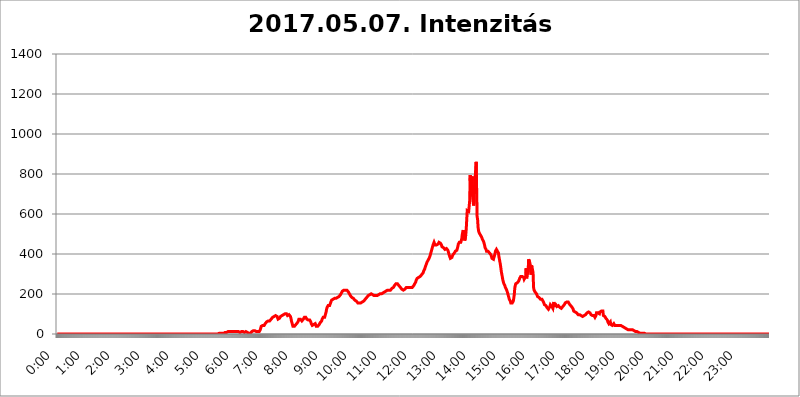
| Category | 2017.05.07. Intenzitás [W/m^2] |
|---|---|
| 0.0 | 0 |
| 0.0006944444444444445 | 0 |
| 0.001388888888888889 | 0 |
| 0.0020833333333333333 | 0 |
| 0.002777777777777778 | 0 |
| 0.003472222222222222 | 0 |
| 0.004166666666666667 | 0 |
| 0.004861111111111111 | 0 |
| 0.005555555555555556 | 0 |
| 0.0062499999999999995 | 0 |
| 0.006944444444444444 | 0 |
| 0.007638888888888889 | 0 |
| 0.008333333333333333 | 0 |
| 0.009027777777777779 | 0 |
| 0.009722222222222222 | 0 |
| 0.010416666666666666 | 0 |
| 0.011111111111111112 | 0 |
| 0.011805555555555555 | 0 |
| 0.012499999999999999 | 0 |
| 0.013194444444444444 | 0 |
| 0.013888888888888888 | 0 |
| 0.014583333333333332 | 0 |
| 0.015277777777777777 | 0 |
| 0.015972222222222224 | 0 |
| 0.016666666666666666 | 0 |
| 0.017361111111111112 | 0 |
| 0.018055555555555557 | 0 |
| 0.01875 | 0 |
| 0.019444444444444445 | 0 |
| 0.02013888888888889 | 0 |
| 0.020833333333333332 | 0 |
| 0.02152777777777778 | 0 |
| 0.022222222222222223 | 0 |
| 0.02291666666666667 | 0 |
| 0.02361111111111111 | 0 |
| 0.024305555555555556 | 0 |
| 0.024999999999999998 | 0 |
| 0.025694444444444447 | 0 |
| 0.02638888888888889 | 0 |
| 0.027083333333333334 | 0 |
| 0.027777777777777776 | 0 |
| 0.02847222222222222 | 0 |
| 0.029166666666666664 | 0 |
| 0.029861111111111113 | 0 |
| 0.030555555555555555 | 0 |
| 0.03125 | 0 |
| 0.03194444444444445 | 0 |
| 0.03263888888888889 | 0 |
| 0.03333333333333333 | 0 |
| 0.034027777777777775 | 0 |
| 0.034722222222222224 | 0 |
| 0.035416666666666666 | 0 |
| 0.036111111111111115 | 0 |
| 0.03680555555555556 | 0 |
| 0.0375 | 0 |
| 0.03819444444444444 | 0 |
| 0.03888888888888889 | 0 |
| 0.03958333333333333 | 0 |
| 0.04027777777777778 | 0 |
| 0.04097222222222222 | 0 |
| 0.041666666666666664 | 0 |
| 0.042361111111111106 | 0 |
| 0.04305555555555556 | 0 |
| 0.043750000000000004 | 0 |
| 0.044444444444444446 | 0 |
| 0.04513888888888889 | 0 |
| 0.04583333333333334 | 0 |
| 0.04652777777777778 | 0 |
| 0.04722222222222222 | 0 |
| 0.04791666666666666 | 0 |
| 0.04861111111111111 | 0 |
| 0.049305555555555554 | 0 |
| 0.049999999999999996 | 0 |
| 0.05069444444444445 | 0 |
| 0.051388888888888894 | 0 |
| 0.052083333333333336 | 0 |
| 0.05277777777777778 | 0 |
| 0.05347222222222222 | 0 |
| 0.05416666666666667 | 0 |
| 0.05486111111111111 | 0 |
| 0.05555555555555555 | 0 |
| 0.05625 | 0 |
| 0.05694444444444444 | 0 |
| 0.057638888888888885 | 0 |
| 0.05833333333333333 | 0 |
| 0.05902777777777778 | 0 |
| 0.059722222222222225 | 0 |
| 0.06041666666666667 | 0 |
| 0.061111111111111116 | 0 |
| 0.06180555555555556 | 0 |
| 0.0625 | 0 |
| 0.06319444444444444 | 0 |
| 0.06388888888888888 | 0 |
| 0.06458333333333334 | 0 |
| 0.06527777777777778 | 0 |
| 0.06597222222222222 | 0 |
| 0.06666666666666667 | 0 |
| 0.06736111111111111 | 0 |
| 0.06805555555555555 | 0 |
| 0.06874999999999999 | 0 |
| 0.06944444444444443 | 0 |
| 0.07013888888888889 | 0 |
| 0.07083333333333333 | 0 |
| 0.07152777777777779 | 0 |
| 0.07222222222222223 | 0 |
| 0.07291666666666667 | 0 |
| 0.07361111111111111 | 0 |
| 0.07430555555555556 | 0 |
| 0.075 | 0 |
| 0.07569444444444444 | 0 |
| 0.0763888888888889 | 0 |
| 0.07708333333333334 | 0 |
| 0.07777777777777778 | 0 |
| 0.07847222222222222 | 0 |
| 0.07916666666666666 | 0 |
| 0.0798611111111111 | 0 |
| 0.08055555555555556 | 0 |
| 0.08125 | 0 |
| 0.08194444444444444 | 0 |
| 0.08263888888888889 | 0 |
| 0.08333333333333333 | 0 |
| 0.08402777777777777 | 0 |
| 0.08472222222222221 | 0 |
| 0.08541666666666665 | 0 |
| 0.08611111111111112 | 0 |
| 0.08680555555555557 | 0 |
| 0.08750000000000001 | 0 |
| 0.08819444444444445 | 0 |
| 0.08888888888888889 | 0 |
| 0.08958333333333333 | 0 |
| 0.09027777777777778 | 0 |
| 0.09097222222222222 | 0 |
| 0.09166666666666667 | 0 |
| 0.09236111111111112 | 0 |
| 0.09305555555555556 | 0 |
| 0.09375 | 0 |
| 0.09444444444444444 | 0 |
| 0.09513888888888888 | 0 |
| 0.09583333333333333 | 0 |
| 0.09652777777777777 | 0 |
| 0.09722222222222222 | 0 |
| 0.09791666666666667 | 0 |
| 0.09861111111111111 | 0 |
| 0.09930555555555555 | 0 |
| 0.09999999999999999 | 0 |
| 0.10069444444444443 | 0 |
| 0.1013888888888889 | 0 |
| 0.10208333333333335 | 0 |
| 0.10277777777777779 | 0 |
| 0.10347222222222223 | 0 |
| 0.10416666666666667 | 0 |
| 0.10486111111111111 | 0 |
| 0.10555555555555556 | 0 |
| 0.10625 | 0 |
| 0.10694444444444444 | 0 |
| 0.1076388888888889 | 0 |
| 0.10833333333333334 | 0 |
| 0.10902777777777778 | 0 |
| 0.10972222222222222 | 0 |
| 0.1111111111111111 | 0 |
| 0.11180555555555556 | 0 |
| 0.11180555555555556 | 0 |
| 0.1125 | 0 |
| 0.11319444444444444 | 0 |
| 0.11388888888888889 | 0 |
| 0.11458333333333333 | 0 |
| 0.11527777777777777 | 0 |
| 0.11597222222222221 | 0 |
| 0.11666666666666665 | 0 |
| 0.1173611111111111 | 0 |
| 0.11805555555555557 | 0 |
| 0.11944444444444445 | 0 |
| 0.12013888888888889 | 0 |
| 0.12083333333333333 | 0 |
| 0.12152777777777778 | 0 |
| 0.12222222222222223 | 0 |
| 0.12291666666666667 | 0 |
| 0.12291666666666667 | 0 |
| 0.12361111111111112 | 0 |
| 0.12430555555555556 | 0 |
| 0.125 | 0 |
| 0.12569444444444444 | 0 |
| 0.12638888888888888 | 0 |
| 0.12708333333333333 | 0 |
| 0.16875 | 0 |
| 0.12847222222222224 | 0 |
| 0.12916666666666668 | 0 |
| 0.12986111111111112 | 0 |
| 0.13055555555555556 | 0 |
| 0.13125 | 0 |
| 0.13194444444444445 | 0 |
| 0.1326388888888889 | 0 |
| 0.13333333333333333 | 0 |
| 0.13402777777777777 | 0 |
| 0.13402777777777777 | 0 |
| 0.13472222222222222 | 0 |
| 0.13541666666666666 | 0 |
| 0.1361111111111111 | 0 |
| 0.13749999999999998 | 0 |
| 0.13819444444444443 | 0 |
| 0.1388888888888889 | 0 |
| 0.13958333333333334 | 0 |
| 0.14027777777777778 | 0 |
| 0.14097222222222222 | 0 |
| 0.14166666666666666 | 0 |
| 0.1423611111111111 | 0 |
| 0.14305555555555557 | 0 |
| 0.14375000000000002 | 0 |
| 0.14444444444444446 | 0 |
| 0.1451388888888889 | 0 |
| 0.1451388888888889 | 0 |
| 0.14652777777777778 | 0 |
| 0.14722222222222223 | 0 |
| 0.14791666666666667 | 0 |
| 0.1486111111111111 | 0 |
| 0.14930555555555555 | 0 |
| 0.15 | 0 |
| 0.15069444444444444 | 0 |
| 0.15138888888888888 | 0 |
| 0.15208333333333332 | 0 |
| 0.15277777777777776 | 0 |
| 0.15347222222222223 | 0 |
| 0.15416666666666667 | 0 |
| 0.15486111111111112 | 0 |
| 0.15555555555555556 | 0 |
| 0.15625 | 0 |
| 0.15694444444444444 | 0 |
| 0.15763888888888888 | 0 |
| 0.15833333333333333 | 0 |
| 0.15902777777777777 | 0 |
| 0.15972222222222224 | 0 |
| 0.16041666666666668 | 0 |
| 0.16111111111111112 | 0 |
| 0.16180555555555556 | 0 |
| 0.1625 | 0 |
| 0.16319444444444445 | 0 |
| 0.1638888888888889 | 0 |
| 0.16458333333333333 | 0 |
| 0.16527777777777777 | 0 |
| 0.16597222222222222 | 0 |
| 0.16666666666666666 | 0 |
| 0.1673611111111111 | 0 |
| 0.16805555555555554 | 0 |
| 0.16874999999999998 | 0 |
| 0.16944444444444443 | 0 |
| 0.17013888888888887 | 0 |
| 0.1708333333333333 | 0 |
| 0.17152777777777775 | 0 |
| 0.17222222222222225 | 0 |
| 0.1729166666666667 | 0 |
| 0.17361111111111113 | 0 |
| 0.17430555555555557 | 0 |
| 0.17500000000000002 | 0 |
| 0.17569444444444446 | 0 |
| 0.1763888888888889 | 0 |
| 0.17708333333333334 | 0 |
| 0.17777777777777778 | 0 |
| 0.17847222222222223 | 0 |
| 0.17916666666666667 | 0 |
| 0.1798611111111111 | 0 |
| 0.18055555555555555 | 0 |
| 0.18125 | 0 |
| 0.18194444444444444 | 0 |
| 0.1826388888888889 | 0 |
| 0.18333333333333335 | 0 |
| 0.1840277777777778 | 0 |
| 0.18472222222222223 | 0 |
| 0.18541666666666667 | 0 |
| 0.18611111111111112 | 0 |
| 0.18680555555555556 | 0 |
| 0.1875 | 0 |
| 0.18819444444444444 | 0 |
| 0.18888888888888888 | 0 |
| 0.18958333333333333 | 0 |
| 0.19027777777777777 | 0 |
| 0.1909722222222222 | 0 |
| 0.19166666666666665 | 0 |
| 0.19236111111111112 | 0 |
| 0.19305555555555554 | 0 |
| 0.19375 | 0 |
| 0.19444444444444445 | 0 |
| 0.1951388888888889 | 0 |
| 0.19583333333333333 | 0 |
| 0.19652777777777777 | 0 |
| 0.19722222222222222 | 0 |
| 0.19791666666666666 | 0 |
| 0.1986111111111111 | 0 |
| 0.19930555555555554 | 0 |
| 0.19999999999999998 | 0 |
| 0.20069444444444443 | 0 |
| 0.20138888888888887 | 0 |
| 0.2020833333333333 | 0 |
| 0.2027777777777778 | 0 |
| 0.2034722222222222 | 0 |
| 0.2041666666666667 | 0 |
| 0.20486111111111113 | 0 |
| 0.20555555555555557 | 0 |
| 0.20625000000000002 | 0 |
| 0.20694444444444446 | 0 |
| 0.2076388888888889 | 0 |
| 0.20833333333333334 | 0 |
| 0.20902777777777778 | 0 |
| 0.20972222222222223 | 0 |
| 0.21041666666666667 | 0 |
| 0.2111111111111111 | 0 |
| 0.21180555555555555 | 0 |
| 0.2125 | 0 |
| 0.21319444444444444 | 0 |
| 0.2138888888888889 | 0 |
| 0.21458333333333335 | 0 |
| 0.2152777777777778 | 0 |
| 0.21597222222222223 | 0 |
| 0.21666666666666667 | 0 |
| 0.21736111111111112 | 0 |
| 0.21805555555555556 | 0 |
| 0.21875 | 0 |
| 0.21944444444444444 | 0 |
| 0.22013888888888888 | 0 |
| 0.22083333333333333 | 0 |
| 0.22152777777777777 | 0 |
| 0.2222222222222222 | 0 |
| 0.22291666666666665 | 0 |
| 0.2236111111111111 | 0 |
| 0.22430555555555556 | 0 |
| 0.225 | 0 |
| 0.22569444444444445 | 3.525 |
| 0.2263888888888889 | 3.525 |
| 0.22708333333333333 | 3.525 |
| 0.22777777777777777 | 3.525 |
| 0.22847222222222222 | 3.525 |
| 0.22916666666666666 | 3.525 |
| 0.2298611111111111 | 3.525 |
| 0.23055555555555554 | 3.525 |
| 0.23124999999999998 | 3.525 |
| 0.23194444444444443 | 3.525 |
| 0.23263888888888887 | 3.525 |
| 0.2333333333333333 | 3.525 |
| 0.2340277777777778 | 7.887 |
| 0.2347222222222222 | 7.887 |
| 0.2354166666666667 | 7.887 |
| 0.23611111111111113 | 7.887 |
| 0.23680555555555557 | 7.887 |
| 0.23750000000000002 | 7.887 |
| 0.23819444444444446 | 7.887 |
| 0.2388888888888889 | 12.257 |
| 0.23958333333333334 | 12.257 |
| 0.24027777777777778 | 12.257 |
| 0.24097222222222223 | 12.257 |
| 0.24166666666666667 | 12.257 |
| 0.2423611111111111 | 12.257 |
| 0.24305555555555555 | 12.257 |
| 0.24375 | 12.257 |
| 0.24444444444444446 | 12.257 |
| 0.24513888888888888 | 12.257 |
| 0.24583333333333335 | 12.257 |
| 0.2465277777777778 | 12.257 |
| 0.24722222222222223 | 12.257 |
| 0.24791666666666667 | 12.257 |
| 0.24861111111111112 | 12.257 |
| 0.24930555555555556 | 12.257 |
| 0.25 | 12.257 |
| 0.25069444444444444 | 12.257 |
| 0.2513888888888889 | 12.257 |
| 0.2520833333333333 | 12.257 |
| 0.25277777777777777 | 12.257 |
| 0.2534722222222222 | 12.257 |
| 0.25416666666666665 | 12.257 |
| 0.2548611111111111 | 7.887 |
| 0.2555555555555556 | 7.887 |
| 0.25625000000000003 | 7.887 |
| 0.2569444444444445 | 12.257 |
| 0.2576388888888889 | 12.257 |
| 0.25833333333333336 | 12.257 |
| 0.2590277777777778 | 12.257 |
| 0.25972222222222224 | 12.257 |
| 0.2604166666666667 | 12.257 |
| 0.2611111111111111 | 7.887 |
| 0.26180555555555557 | 7.887 |
| 0.2625 | 7.887 |
| 0.26319444444444445 | 7.887 |
| 0.2638888888888889 | 12.257 |
| 0.26458333333333334 | 12.257 |
| 0.2652777777777778 | 12.257 |
| 0.2659722222222222 | 12.257 |
| 0.26666666666666666 | 7.887 |
| 0.2673611111111111 | 7.887 |
| 0.26805555555555555 | 3.525 |
| 0.26875 | 3.525 |
| 0.26944444444444443 | 3.525 |
| 0.2701388888888889 | 3.525 |
| 0.2708333333333333 | 3.525 |
| 0.27152777777777776 | 7.887 |
| 0.2722222222222222 | 7.887 |
| 0.27291666666666664 | 12.257 |
| 0.2736111111111111 | 12.257 |
| 0.2743055555555555 | 16.636 |
| 0.27499999999999997 | 16.636 |
| 0.27569444444444446 | 21.024 |
| 0.27638888888888885 | 16.636 |
| 0.27708333333333335 | 16.636 |
| 0.2777777777777778 | 16.636 |
| 0.27847222222222223 | 16.636 |
| 0.2791666666666667 | 12.257 |
| 0.2798611111111111 | 12.257 |
| 0.28055555555555556 | 12.257 |
| 0.28125 | 12.257 |
| 0.28194444444444444 | 12.257 |
| 0.2826388888888889 | 12.257 |
| 0.2833333333333333 | 12.257 |
| 0.28402777777777777 | 12.257 |
| 0.2847222222222222 | 21.024 |
| 0.28541666666666665 | 29.823 |
| 0.28611111111111115 | 38.653 |
| 0.28680555555555554 | 43.079 |
| 0.28750000000000003 | 43.079 |
| 0.2881944444444445 | 43.079 |
| 0.2888888888888889 | 38.653 |
| 0.28958333333333336 | 38.653 |
| 0.2902777777777778 | 43.079 |
| 0.29097222222222224 | 47.511 |
| 0.2916666666666667 | 51.951 |
| 0.2923611111111111 | 56.398 |
| 0.29305555555555557 | 56.398 |
| 0.29375 | 60.85 |
| 0.29444444444444445 | 65.31 |
| 0.2951388888888889 | 65.31 |
| 0.29583333333333334 | 65.31 |
| 0.2965277777777778 | 65.31 |
| 0.2972222222222222 | 69.775 |
| 0.29791666666666666 | 65.31 |
| 0.2986111111111111 | 65.31 |
| 0.29930555555555555 | 69.775 |
| 0.3 | 74.246 |
| 0.30069444444444443 | 74.246 |
| 0.3013888888888889 | 78.722 |
| 0.3020833333333333 | 83.205 |
| 0.30277777777777776 | 83.205 |
| 0.3034722222222222 | 83.205 |
| 0.30416666666666664 | 87.692 |
| 0.3048611111111111 | 92.184 |
| 0.3055555555555555 | 92.184 |
| 0.30624999999999997 | 92.184 |
| 0.3069444444444444 | 92.184 |
| 0.3076388888888889 | 92.184 |
| 0.30833333333333335 | 87.692 |
| 0.3090277777777778 | 83.205 |
| 0.30972222222222223 | 74.246 |
| 0.3104166666666667 | 74.246 |
| 0.3111111111111111 | 74.246 |
| 0.31180555555555556 | 78.722 |
| 0.3125 | 83.205 |
| 0.31319444444444444 | 87.692 |
| 0.3138888888888889 | 92.184 |
| 0.3145833333333333 | 92.184 |
| 0.31527777777777777 | 92.184 |
| 0.3159722222222222 | 96.682 |
| 0.31666666666666665 | 96.682 |
| 0.31736111111111115 | 96.682 |
| 0.31805555555555554 | 101.184 |
| 0.31875000000000003 | 101.184 |
| 0.3194444444444445 | 101.184 |
| 0.3201388888888889 | 101.184 |
| 0.32083333333333336 | 101.184 |
| 0.3215277777777778 | 101.184 |
| 0.32222222222222224 | 96.682 |
| 0.3229166666666667 | 92.184 |
| 0.3236111111111111 | 96.682 |
| 0.32430555555555557 | 96.682 |
| 0.325 | 96.682 |
| 0.32569444444444445 | 96.682 |
| 0.3263888888888889 | 92.184 |
| 0.32708333333333334 | 87.692 |
| 0.3277777777777778 | 78.722 |
| 0.3284722222222222 | 65.31 |
| 0.32916666666666666 | 56.398 |
| 0.3298611111111111 | 47.511 |
| 0.33055555555555555 | 38.653 |
| 0.33125 | 38.653 |
| 0.33194444444444443 | 38.653 |
| 0.3326388888888889 | 38.653 |
| 0.3333333333333333 | 38.653 |
| 0.3340277777777778 | 43.079 |
| 0.3347222222222222 | 47.511 |
| 0.3354166666666667 | 51.951 |
| 0.3361111111111111 | 51.951 |
| 0.3368055555555556 | 56.398 |
| 0.33749999999999997 | 60.85 |
| 0.33819444444444446 | 65.31 |
| 0.33888888888888885 | 74.246 |
| 0.33958333333333335 | 78.722 |
| 0.34027777777777773 | 78.722 |
| 0.34097222222222223 | 74.246 |
| 0.3416666666666666 | 74.246 |
| 0.3423611111111111 | 69.775 |
| 0.3430555555555555 | 65.31 |
| 0.34375 | 69.775 |
| 0.3444444444444445 | 69.775 |
| 0.3451388888888889 | 74.246 |
| 0.3458333333333334 | 74.246 |
| 0.34652777777777777 | 83.205 |
| 0.34722222222222227 | 83.205 |
| 0.34791666666666665 | 83.205 |
| 0.34861111111111115 | 83.205 |
| 0.34930555555555554 | 83.205 |
| 0.35000000000000003 | 74.246 |
| 0.3506944444444444 | 74.246 |
| 0.3513888888888889 | 69.775 |
| 0.3520833333333333 | 69.775 |
| 0.3527777777777778 | 69.775 |
| 0.3534722222222222 | 69.775 |
| 0.3541666666666667 | 69.775 |
| 0.3548611111111111 | 65.31 |
| 0.35555555555555557 | 60.85 |
| 0.35625 | 51.951 |
| 0.35694444444444445 | 47.511 |
| 0.3576388888888889 | 43.079 |
| 0.35833333333333334 | 43.079 |
| 0.3590277777777778 | 47.511 |
| 0.3597222222222222 | 47.511 |
| 0.36041666666666666 | 47.511 |
| 0.3611111111111111 | 51.951 |
| 0.36180555555555555 | 51.951 |
| 0.3625 | 47.511 |
| 0.36319444444444443 | 38.653 |
| 0.3638888888888889 | 38.653 |
| 0.3645833333333333 | 38.653 |
| 0.3652777777777778 | 38.653 |
| 0.3659722222222222 | 43.079 |
| 0.3666666666666667 | 43.079 |
| 0.3673611111111111 | 47.511 |
| 0.3680555555555556 | 51.951 |
| 0.36874999999999997 | 56.398 |
| 0.36944444444444446 | 56.398 |
| 0.37013888888888885 | 60.85 |
| 0.37083333333333335 | 65.31 |
| 0.37152777777777773 | 74.246 |
| 0.37222222222222223 | 78.722 |
| 0.3729166666666666 | 83.205 |
| 0.3736111111111111 | 83.205 |
| 0.3743055555555555 | 83.205 |
| 0.375 | 83.205 |
| 0.3756944444444445 | 92.184 |
| 0.3763888888888889 | 101.184 |
| 0.3770833333333334 | 110.201 |
| 0.37777777777777777 | 123.758 |
| 0.37847222222222227 | 132.814 |
| 0.37916666666666665 | 137.347 |
| 0.37986111111111115 | 141.884 |
| 0.38055555555555554 | 141.884 |
| 0.38125000000000003 | 137.347 |
| 0.3819444444444444 | 141.884 |
| 0.3826388888888889 | 146.423 |
| 0.3833333333333333 | 155.509 |
| 0.3840277777777778 | 160.056 |
| 0.3847222222222222 | 169.156 |
| 0.3854166666666667 | 173.709 |
| 0.3861111111111111 | 173.709 |
| 0.38680555555555557 | 173.709 |
| 0.3875 | 178.264 |
| 0.38819444444444445 | 178.264 |
| 0.3888888888888889 | 178.264 |
| 0.38958333333333334 | 178.264 |
| 0.3902777777777778 | 178.264 |
| 0.3909722222222222 | 178.264 |
| 0.39166666666666666 | 178.264 |
| 0.3923611111111111 | 178.264 |
| 0.39305555555555555 | 182.82 |
| 0.39375 | 182.82 |
| 0.39444444444444443 | 182.82 |
| 0.3951388888888889 | 187.378 |
| 0.3958333333333333 | 191.937 |
| 0.3965277777777778 | 191.937 |
| 0.3972222222222222 | 196.497 |
| 0.3979166666666667 | 201.058 |
| 0.3986111111111111 | 205.62 |
| 0.3993055555555556 | 210.182 |
| 0.39999999999999997 | 214.746 |
| 0.40069444444444446 | 219.309 |
| 0.40138888888888885 | 219.309 |
| 0.40208333333333335 | 219.309 |
| 0.40277777777777773 | 219.309 |
| 0.40347222222222223 | 219.309 |
| 0.4041666666666666 | 219.309 |
| 0.4048611111111111 | 219.309 |
| 0.4055555555555555 | 219.309 |
| 0.40625 | 219.309 |
| 0.4069444444444445 | 219.309 |
| 0.4076388888888889 | 214.746 |
| 0.4083333333333334 | 210.182 |
| 0.40902777777777777 | 205.62 |
| 0.40972222222222227 | 201.058 |
| 0.41041666666666665 | 196.497 |
| 0.41111111111111115 | 191.937 |
| 0.41180555555555554 | 191.937 |
| 0.41250000000000003 | 187.378 |
| 0.4131944444444444 | 182.82 |
| 0.4138888888888889 | 182.82 |
| 0.4145833333333333 | 178.264 |
| 0.4152777777777778 | 178.264 |
| 0.4159722222222222 | 173.709 |
| 0.4166666666666667 | 173.709 |
| 0.4173611111111111 | 169.156 |
| 0.41805555555555557 | 164.605 |
| 0.41875 | 164.605 |
| 0.41944444444444445 | 164.605 |
| 0.4201388888888889 | 160.056 |
| 0.42083333333333334 | 160.056 |
| 0.4215277777777778 | 155.509 |
| 0.4222222222222222 | 155.509 |
| 0.42291666666666666 | 155.509 |
| 0.4236111111111111 | 155.509 |
| 0.42430555555555555 | 155.509 |
| 0.425 | 155.509 |
| 0.42569444444444443 | 155.509 |
| 0.4263888888888889 | 155.509 |
| 0.4270833333333333 | 155.509 |
| 0.4277777777777778 | 160.056 |
| 0.4284722222222222 | 160.056 |
| 0.4291666666666667 | 164.605 |
| 0.4298611111111111 | 164.605 |
| 0.4305555555555556 | 169.156 |
| 0.43124999999999997 | 169.156 |
| 0.43194444444444446 | 173.709 |
| 0.43263888888888885 | 173.709 |
| 0.43333333333333335 | 178.264 |
| 0.43402777777777773 | 182.82 |
| 0.43472222222222223 | 182.82 |
| 0.4354166666666666 | 187.378 |
| 0.4361111111111111 | 191.937 |
| 0.4368055555555555 | 191.937 |
| 0.4375 | 196.497 |
| 0.4381944444444445 | 196.497 |
| 0.4388888888888889 | 196.497 |
| 0.4395833333333334 | 201.058 |
| 0.44027777777777777 | 201.058 |
| 0.44097222222222227 | 196.497 |
| 0.44166666666666665 | 196.497 |
| 0.44236111111111115 | 196.497 |
| 0.44305555555555554 | 191.937 |
| 0.44375000000000003 | 191.937 |
| 0.4444444444444444 | 191.937 |
| 0.4451388888888889 | 191.937 |
| 0.4458333333333333 | 191.937 |
| 0.4465277777777778 | 191.937 |
| 0.4472222222222222 | 191.937 |
| 0.4479166666666667 | 191.937 |
| 0.4486111111111111 | 191.937 |
| 0.44930555555555557 | 196.497 |
| 0.45 | 196.497 |
| 0.45069444444444445 | 196.497 |
| 0.4513888888888889 | 201.058 |
| 0.45208333333333334 | 201.058 |
| 0.4527777777777778 | 201.058 |
| 0.4534722222222222 | 201.058 |
| 0.45416666666666666 | 201.058 |
| 0.4548611111111111 | 201.058 |
| 0.45555555555555555 | 205.62 |
| 0.45625 | 205.62 |
| 0.45694444444444443 | 205.62 |
| 0.4576388888888889 | 205.62 |
| 0.4583333333333333 | 205.62 |
| 0.4590277777777778 | 210.182 |
| 0.4597222222222222 | 210.182 |
| 0.4604166666666667 | 210.182 |
| 0.4611111111111111 | 214.746 |
| 0.4618055555555556 | 214.746 |
| 0.46249999999999997 | 214.746 |
| 0.46319444444444446 | 219.309 |
| 0.46388888888888885 | 219.309 |
| 0.46458333333333335 | 214.746 |
| 0.46527777777777773 | 219.309 |
| 0.46597222222222223 | 219.309 |
| 0.4666666666666666 | 219.309 |
| 0.4673611111111111 | 219.309 |
| 0.4680555555555555 | 219.309 |
| 0.46875 | 223.873 |
| 0.4694444444444445 | 228.436 |
| 0.4701388888888889 | 228.436 |
| 0.4708333333333334 | 233 |
| 0.47152777777777777 | 233 |
| 0.47222222222222227 | 237.564 |
| 0.47291666666666665 | 242.127 |
| 0.47361111111111115 | 246.689 |
| 0.47430555555555554 | 246.689 |
| 0.47500000000000003 | 251.251 |
| 0.4756944444444444 | 251.251 |
| 0.4763888888888889 | 251.251 |
| 0.4770833333333333 | 251.251 |
| 0.4777777777777778 | 251.251 |
| 0.4784722222222222 | 246.689 |
| 0.4791666666666667 | 242.127 |
| 0.4798611111111111 | 242.127 |
| 0.48055555555555557 | 237.564 |
| 0.48125 | 233 |
| 0.48194444444444445 | 228.436 |
| 0.4826388888888889 | 228.436 |
| 0.48333333333333334 | 223.873 |
| 0.4840277777777778 | 223.873 |
| 0.4847222222222222 | 219.309 |
| 0.48541666666666666 | 219.309 |
| 0.4861111111111111 | 223.873 |
| 0.48680555555555555 | 223.873 |
| 0.4875 | 223.873 |
| 0.48819444444444443 | 228.436 |
| 0.4888888888888889 | 228.436 |
| 0.4895833333333333 | 233 |
| 0.4902777777777778 | 233 |
| 0.4909722222222222 | 233 |
| 0.4916666666666667 | 233 |
| 0.4923611111111111 | 233 |
| 0.4930555555555556 | 233 |
| 0.49374999999999997 | 233 |
| 0.49444444444444446 | 233 |
| 0.49513888888888885 | 233 |
| 0.49583333333333335 | 233 |
| 0.49652777777777773 | 233 |
| 0.49722222222222223 | 233 |
| 0.4979166666666666 | 233 |
| 0.4986111111111111 | 237.564 |
| 0.4993055555555555 | 237.564 |
| 0.5 | 242.127 |
| 0.5006944444444444 | 242.127 |
| 0.5013888888888889 | 251.251 |
| 0.5020833333333333 | 255.813 |
| 0.5027777777777778 | 260.373 |
| 0.5034722222222222 | 269.49 |
| 0.5041666666666667 | 269.49 |
| 0.5048611111111111 | 278.603 |
| 0.5055555555555555 | 278.603 |
| 0.50625 | 278.603 |
| 0.5069444444444444 | 283.156 |
| 0.5076388888888889 | 283.156 |
| 0.5083333333333333 | 287.709 |
| 0.5090277777777777 | 287.709 |
| 0.5097222222222222 | 292.259 |
| 0.5104166666666666 | 292.259 |
| 0.5111111111111112 | 296.808 |
| 0.5118055555555555 | 296.808 |
| 0.5125000000000001 | 301.354 |
| 0.5131944444444444 | 305.898 |
| 0.513888888888889 | 314.98 |
| 0.5145833333333333 | 319.517 |
| 0.5152777777777778 | 324.052 |
| 0.5159722222222222 | 333.113 |
| 0.5166666666666667 | 337.639 |
| 0.517361111111111 | 346.682 |
| 0.5180555555555556 | 351.198 |
| 0.5187499999999999 | 360.221 |
| 0.5194444444444445 | 364.728 |
| 0.5201388888888888 | 369.23 |
| 0.5208333333333334 | 373.729 |
| 0.5215277777777778 | 378.224 |
| 0.5222222222222223 | 382.715 |
| 0.5229166666666667 | 391.685 |
| 0.5236111111111111 | 396.164 |
| 0.5243055555555556 | 409.574 |
| 0.525 | 418.492 |
| 0.5256944444444445 | 427.39 |
| 0.5263888888888889 | 436.27 |
| 0.5270833333333333 | 445.129 |
| 0.5277777777777778 | 449.551 |
| 0.5284722222222222 | 458.38 |
| 0.5291666666666667 | 453.968 |
| 0.5298611111111111 | 445.129 |
| 0.5305555555555556 | 445.129 |
| 0.53125 | 445.129 |
| 0.5319444444444444 | 445.129 |
| 0.5326388888888889 | 445.129 |
| 0.5333333333333333 | 449.551 |
| 0.5340277777777778 | 449.551 |
| 0.5347222222222222 | 453.968 |
| 0.5354166666666667 | 458.38 |
| 0.5361111111111111 | 458.38 |
| 0.5368055555555555 | 458.38 |
| 0.5375 | 453.968 |
| 0.5381944444444444 | 453.968 |
| 0.5388888888888889 | 445.129 |
| 0.5395833333333333 | 436.27 |
| 0.5402777777777777 | 436.27 |
| 0.5409722222222222 | 436.27 |
| 0.5416666666666666 | 431.833 |
| 0.5423611111111112 | 427.39 |
| 0.5430555555555555 | 427.39 |
| 0.5437500000000001 | 422.943 |
| 0.5444444444444444 | 422.943 |
| 0.545138888888889 | 422.943 |
| 0.5458333333333333 | 427.39 |
| 0.5465277777777778 | 422.943 |
| 0.5472222222222222 | 422.943 |
| 0.5479166666666667 | 418.492 |
| 0.548611111111111 | 409.574 |
| 0.5493055555555556 | 400.638 |
| 0.5499999999999999 | 391.685 |
| 0.5506944444444445 | 387.202 |
| 0.5513888888888888 | 378.224 |
| 0.5520833333333334 | 378.224 |
| 0.5527777777777778 | 378.224 |
| 0.5534722222222223 | 382.715 |
| 0.5541666666666667 | 387.202 |
| 0.5548611111111111 | 396.164 |
| 0.5555555555555556 | 396.164 |
| 0.55625 | 400.638 |
| 0.5569444444444445 | 405.108 |
| 0.5576388888888889 | 409.574 |
| 0.5583333333333333 | 414.035 |
| 0.5590277777777778 | 414.035 |
| 0.5597222222222222 | 414.035 |
| 0.5604166666666667 | 418.492 |
| 0.5611111111111111 | 427.39 |
| 0.5618055555555556 | 436.27 |
| 0.5625 | 449.551 |
| 0.5631944444444444 | 453.968 |
| 0.5638888888888889 | 458.38 |
| 0.5645833333333333 | 458.38 |
| 0.5652777777777778 | 458.38 |
| 0.5659722222222222 | 458.38 |
| 0.5666666666666667 | 462.786 |
| 0.5673611111111111 | 475.972 |
| 0.5680555555555555 | 497.836 |
| 0.56875 | 510.885 |
| 0.5694444444444444 | 519.555 |
| 0.5701388888888889 | 515.223 |
| 0.5708333333333333 | 493.475 |
| 0.5715277777777777 | 467.187 |
| 0.5722222222222222 | 471.582 |
| 0.5729166666666666 | 493.475 |
| 0.5736111111111112 | 523.88 |
| 0.5743055555555555 | 571.049 |
| 0.5750000000000001 | 617.436 |
| 0.5756944444444444 | 617.436 |
| 0.576388888888889 | 613.252 |
| 0.5770833333333333 | 613.252 |
| 0.5777777777777778 | 617.436 |
| 0.5784722222222222 | 667.123 |
| 0.5791666666666667 | 795.074 |
| 0.579861111111111 | 719.877 |
| 0.5805555555555556 | 703.762 |
| 0.5812499999999999 | 707.8 |
| 0.5819444444444445 | 787.258 |
| 0.5826388888888888 | 683.473 |
| 0.5833333333333334 | 658.909 |
| 0.5840277777777778 | 642.4 |
| 0.5847222222222223 | 658.909 |
| 0.5854166666666667 | 747.834 |
| 0.5861111111111111 | 775.492 |
| 0.5868055555555556 | 779.42 |
| 0.5875 | 860.676 |
| 0.5881944444444445 | 727.896 |
| 0.5888888888888889 | 588.009 |
| 0.5895833333333333 | 571.049 |
| 0.5902777777777778 | 532.513 |
| 0.5909722222222222 | 515.223 |
| 0.5916666666666667 | 506.542 |
| 0.5923611111111111 | 502.192 |
| 0.5930555555555556 | 497.836 |
| 0.59375 | 497.836 |
| 0.5944444444444444 | 497.836 |
| 0.5951388888888889 | 484.735 |
| 0.5958333333333333 | 480.356 |
| 0.5965277777777778 | 471.582 |
| 0.5972222222222222 | 467.187 |
| 0.5979166666666667 | 462.786 |
| 0.5986111111111111 | 453.968 |
| 0.5993055555555555 | 445.129 |
| 0.6 | 431.833 |
| 0.6006944444444444 | 427.39 |
| 0.6013888888888889 | 422.943 |
| 0.6020833333333333 | 414.035 |
| 0.6027777777777777 | 414.035 |
| 0.6034722222222222 | 414.035 |
| 0.6041666666666666 | 414.035 |
| 0.6048611111111112 | 409.574 |
| 0.6055555555555555 | 409.574 |
| 0.6062500000000001 | 405.108 |
| 0.6069444444444444 | 405.108 |
| 0.607638888888889 | 400.638 |
| 0.6083333333333333 | 396.164 |
| 0.6090277777777778 | 387.202 |
| 0.6097222222222222 | 378.224 |
| 0.6104166666666667 | 378.224 |
| 0.611111111111111 | 373.729 |
| 0.6118055555555556 | 373.729 |
| 0.6124999999999999 | 378.224 |
| 0.6131944444444445 | 391.685 |
| 0.6138888888888888 | 400.638 |
| 0.6145833333333334 | 414.035 |
| 0.6152777777777778 | 418.492 |
| 0.6159722222222223 | 422.943 |
| 0.6166666666666667 | 422.943 |
| 0.6173611111111111 | 414.035 |
| 0.6180555555555556 | 414.035 |
| 0.61875 | 405.108 |
| 0.6194444444444445 | 387.202 |
| 0.6201388888888889 | 373.729 |
| 0.6208333333333333 | 360.221 |
| 0.6215277777777778 | 346.682 |
| 0.6222222222222222 | 328.584 |
| 0.6229166666666667 | 310.44 |
| 0.6236111111111111 | 296.808 |
| 0.6243055555555556 | 283.156 |
| 0.625 | 269.49 |
| 0.6256944444444444 | 260.373 |
| 0.6263888888888889 | 251.251 |
| 0.6270833333333333 | 246.689 |
| 0.6277777777777778 | 242.127 |
| 0.6284722222222222 | 233 |
| 0.6291666666666667 | 228.436 |
| 0.6298611111111111 | 223.873 |
| 0.6305555555555555 | 219.309 |
| 0.63125 | 210.182 |
| 0.6319444444444444 | 201.058 |
| 0.6326388888888889 | 191.937 |
| 0.6333333333333333 | 182.82 |
| 0.6340277777777777 | 173.709 |
| 0.6347222222222222 | 169.156 |
| 0.6354166666666666 | 164.605 |
| 0.6361111111111112 | 155.509 |
| 0.6368055555555555 | 155.509 |
| 0.6375000000000001 | 155.509 |
| 0.6381944444444444 | 155.509 |
| 0.638888888888889 | 160.056 |
| 0.6395833333333333 | 164.605 |
| 0.6402777777777778 | 178.264 |
| 0.6409722222222222 | 196.497 |
| 0.6416666666666667 | 228.436 |
| 0.642361111111111 | 242.127 |
| 0.6430555555555556 | 251.251 |
| 0.6437499999999999 | 251.251 |
| 0.6444444444444445 | 251.251 |
| 0.6451388888888888 | 255.813 |
| 0.6458333333333334 | 255.813 |
| 0.6465277777777778 | 260.373 |
| 0.6472222222222223 | 264.932 |
| 0.6479166666666667 | 269.49 |
| 0.6486111111111111 | 278.603 |
| 0.6493055555555556 | 283.156 |
| 0.65 | 287.709 |
| 0.6506944444444445 | 287.709 |
| 0.6513888888888889 | 287.709 |
| 0.6520833333333333 | 287.709 |
| 0.6527777777777778 | 287.709 |
| 0.6534722222222222 | 287.709 |
| 0.6541666666666667 | 283.156 |
| 0.6548611111111111 | 274.047 |
| 0.6555555555555556 | 269.49 |
| 0.65625 | 269.49 |
| 0.6569444444444444 | 287.709 |
| 0.6576388888888889 | 328.584 |
| 0.6583333333333333 | 278.603 |
| 0.6590277777777778 | 292.259 |
| 0.6597222222222222 | 287.709 |
| 0.6604166666666667 | 310.44 |
| 0.6611111111111111 | 373.729 |
| 0.6618055555555555 | 373.729 |
| 0.6625 | 360.221 |
| 0.6631944444444444 | 351.198 |
| 0.6638888888888889 | 346.682 |
| 0.6645833333333333 | 296.808 |
| 0.6652777777777777 | 342.162 |
| 0.6659722222222222 | 333.113 |
| 0.6666666666666666 | 319.517 |
| 0.6673611111111111 | 305.898 |
| 0.6680555555555556 | 233 |
| 0.6687500000000001 | 219.309 |
| 0.6694444444444444 | 214.746 |
| 0.6701388888888888 | 210.182 |
| 0.6708333333333334 | 210.182 |
| 0.6715277777777778 | 205.62 |
| 0.6722222222222222 | 201.058 |
| 0.6729166666666666 | 196.497 |
| 0.6736111111111112 | 187.378 |
| 0.6743055555555556 | 182.82 |
| 0.6749999999999999 | 182.82 |
| 0.6756944444444444 | 182.82 |
| 0.6763888888888889 | 182.82 |
| 0.6770833333333334 | 178.264 |
| 0.6777777777777777 | 173.709 |
| 0.6784722222222223 | 178.264 |
| 0.6791666666666667 | 173.709 |
| 0.6798611111111111 | 173.709 |
| 0.6805555555555555 | 173.709 |
| 0.68125 | 169.156 |
| 0.6819444444444445 | 160.056 |
| 0.6826388888888889 | 155.509 |
| 0.6833333333333332 | 146.423 |
| 0.6840277777777778 | 146.423 |
| 0.6847222222222222 | 141.884 |
| 0.6854166666666667 | 141.884 |
| 0.686111111111111 | 137.347 |
| 0.6868055555555556 | 132.814 |
| 0.6875 | 128.284 |
| 0.6881944444444444 | 128.284 |
| 0.688888888888889 | 123.758 |
| 0.6895833333333333 | 123.758 |
| 0.6902777777777778 | 128.284 |
| 0.6909722222222222 | 137.347 |
| 0.6916666666666668 | 146.423 |
| 0.6923611111111111 | 146.423 |
| 0.6930555555555555 | 141.884 |
| 0.69375 | 137.347 |
| 0.6944444444444445 | 132.814 |
| 0.6951388888888889 | 128.284 |
| 0.6958333333333333 | 132.814 |
| 0.6965277777777777 | 160.056 |
| 0.6972222222222223 | 141.884 |
| 0.6979166666666666 | 137.347 |
| 0.6986111111111111 | 141.884 |
| 0.6993055555555556 | 146.423 |
| 0.7000000000000001 | 141.884 |
| 0.7006944444444444 | 137.347 |
| 0.7013888888888888 | 137.347 |
| 0.7020833333333334 | 141.884 |
| 0.7027777777777778 | 141.884 |
| 0.7034722222222222 | 141.884 |
| 0.7041666666666666 | 137.347 |
| 0.7048611111111112 | 132.814 |
| 0.7055555555555556 | 128.284 |
| 0.7062499999999999 | 128.284 |
| 0.7069444444444444 | 128.284 |
| 0.7076388888888889 | 128.284 |
| 0.7083333333333334 | 132.814 |
| 0.7090277777777777 | 137.347 |
| 0.7097222222222223 | 141.884 |
| 0.7104166666666667 | 141.884 |
| 0.7111111111111111 | 146.423 |
| 0.7118055555555555 | 150.964 |
| 0.7125 | 155.509 |
| 0.7131944444444445 | 155.509 |
| 0.7138888888888889 | 160.056 |
| 0.7145833333333332 | 160.056 |
| 0.7152777777777778 | 160.056 |
| 0.7159722222222222 | 160.056 |
| 0.7166666666666667 | 160.056 |
| 0.717361111111111 | 155.509 |
| 0.7180555555555556 | 150.964 |
| 0.71875 | 146.423 |
| 0.7194444444444444 | 146.423 |
| 0.720138888888889 | 141.884 |
| 0.7208333333333333 | 141.884 |
| 0.7215277777777778 | 137.347 |
| 0.7222222222222222 | 132.814 |
| 0.7229166666666668 | 128.284 |
| 0.7236111111111111 | 123.758 |
| 0.7243055555555555 | 114.716 |
| 0.725 | 110.201 |
| 0.7256944444444445 | 110.201 |
| 0.7263888888888889 | 110.201 |
| 0.7270833333333333 | 110.201 |
| 0.7277777777777777 | 105.69 |
| 0.7284722222222223 | 105.69 |
| 0.7291666666666666 | 101.184 |
| 0.7298611111111111 | 101.184 |
| 0.7305555555555556 | 96.682 |
| 0.7312500000000001 | 96.682 |
| 0.7319444444444444 | 96.682 |
| 0.7326388888888888 | 96.682 |
| 0.7333333333333334 | 96.682 |
| 0.7340277777777778 | 92.184 |
| 0.7347222222222222 | 92.184 |
| 0.7354166666666666 | 92.184 |
| 0.7361111111111112 | 87.692 |
| 0.7368055555555556 | 87.692 |
| 0.7374999999999999 | 87.692 |
| 0.7381944444444444 | 87.692 |
| 0.7388888888888889 | 92.184 |
| 0.7395833333333334 | 92.184 |
| 0.7402777777777777 | 96.682 |
| 0.7409722222222223 | 96.682 |
| 0.7416666666666667 | 101.184 |
| 0.7423611111111111 | 101.184 |
| 0.7430555555555555 | 105.69 |
| 0.74375 | 110.201 |
| 0.7444444444444445 | 110.201 |
| 0.7451388888888889 | 110.201 |
| 0.7458333333333332 | 110.201 |
| 0.7465277777777778 | 114.716 |
| 0.7472222222222222 | 105.69 |
| 0.7479166666666667 | 101.184 |
| 0.748611111111111 | 96.682 |
| 0.7493055555555556 | 101.184 |
| 0.75 | 96.682 |
| 0.7506944444444444 | 92.184 |
| 0.751388888888889 | 92.184 |
| 0.7520833333333333 | 87.692 |
| 0.7527777777777778 | 92.184 |
| 0.7534722222222222 | 96.682 |
| 0.7541666666666668 | 83.205 |
| 0.7548611111111111 | 83.205 |
| 0.7555555555555555 | 92.184 |
| 0.75625 | 105.69 |
| 0.7569444444444445 | 105.69 |
| 0.7576388888888889 | 105.69 |
| 0.7583333333333333 | 105.69 |
| 0.7590277777777777 | 105.69 |
| 0.7597222222222223 | 105.69 |
| 0.7604166666666666 | 101.184 |
| 0.7611111111111111 | 110.201 |
| 0.7618055555555556 | 110.201 |
| 0.7625000000000001 | 114.716 |
| 0.7631944444444444 | 114.716 |
| 0.7638888888888888 | 119.235 |
| 0.7645833333333334 | 119.235 |
| 0.7652777777777778 | 114.716 |
| 0.7659722222222222 | 92.184 |
| 0.7666666666666666 | 92.184 |
| 0.7673611111111112 | 92.184 |
| 0.7680555555555556 | 87.692 |
| 0.7687499999999999 | 92.184 |
| 0.7694444444444444 | 78.722 |
| 0.7701388888888889 | 74.246 |
| 0.7708333333333334 | 74.246 |
| 0.7715277777777777 | 69.775 |
| 0.7722222222222223 | 60.85 |
| 0.7729166666666667 | 56.398 |
| 0.7736111111111111 | 51.951 |
| 0.7743055555555555 | 51.951 |
| 0.775 | 56.398 |
| 0.7756944444444445 | 60.85 |
| 0.7763888888888889 | 47.511 |
| 0.7770833333333332 | 47.511 |
| 0.7777777777777778 | 43.079 |
| 0.7784722222222222 | 43.079 |
| 0.7791666666666667 | 43.079 |
| 0.779861111111111 | 47.511 |
| 0.7805555555555556 | 51.951 |
| 0.78125 | 51.951 |
| 0.7819444444444444 | 43.079 |
| 0.782638888888889 | 43.079 |
| 0.7833333333333333 | 43.079 |
| 0.7840277777777778 | 43.079 |
| 0.7847222222222222 | 43.079 |
| 0.7854166666666668 | 43.079 |
| 0.7861111111111111 | 43.079 |
| 0.7868055555555555 | 43.079 |
| 0.7875 | 43.079 |
| 0.7881944444444445 | 43.079 |
| 0.7888888888888889 | 47.511 |
| 0.7895833333333333 | 43.079 |
| 0.7902777777777777 | 43.079 |
| 0.7909722222222223 | 43.079 |
| 0.7916666666666666 | 43.079 |
| 0.7923611111111111 | 38.653 |
| 0.7930555555555556 | 38.653 |
| 0.7937500000000001 | 34.234 |
| 0.7944444444444444 | 34.234 |
| 0.7951388888888888 | 29.823 |
| 0.7958333333333334 | 29.823 |
| 0.7965277777777778 | 29.823 |
| 0.7972222222222222 | 29.823 |
| 0.7979166666666666 | 25.419 |
| 0.7986111111111112 | 25.419 |
| 0.7993055555555556 | 25.419 |
| 0.7999999999999999 | 21.024 |
| 0.8006944444444444 | 21.024 |
| 0.8013888888888889 | 21.024 |
| 0.8020833333333334 | 21.024 |
| 0.8027777777777777 | 21.024 |
| 0.8034722222222223 | 21.024 |
| 0.8041666666666667 | 21.024 |
| 0.8048611111111111 | 21.024 |
| 0.8055555555555555 | 16.636 |
| 0.80625 | 21.024 |
| 0.8069444444444445 | 21.024 |
| 0.8076388888888889 | 21.024 |
| 0.8083333333333332 | 16.636 |
| 0.8090277777777778 | 16.636 |
| 0.8097222222222222 | 16.636 |
| 0.8104166666666667 | 12.257 |
| 0.811111111111111 | 12.257 |
| 0.8118055555555556 | 12.257 |
| 0.8125 | 12.257 |
| 0.8131944444444444 | 12.257 |
| 0.813888888888889 | 7.887 |
| 0.8145833333333333 | 7.887 |
| 0.8152777777777778 | 7.887 |
| 0.8159722222222222 | 7.887 |
| 0.8166666666666668 | 7.887 |
| 0.8173611111111111 | 3.525 |
| 0.8180555555555555 | 3.525 |
| 0.81875 | 3.525 |
| 0.8194444444444445 | 3.525 |
| 0.8201388888888889 | 3.525 |
| 0.8208333333333333 | 3.525 |
| 0.8215277777777777 | 3.525 |
| 0.8222222222222223 | 3.525 |
| 0.8229166666666666 | 3.525 |
| 0.8236111111111111 | 3.525 |
| 0.8243055555555556 | 3.525 |
| 0.8250000000000001 | 3.525 |
| 0.8256944444444444 | 0 |
| 0.8263888888888888 | 0 |
| 0.8270833333333334 | 3.525 |
| 0.8277777777777778 | 0 |
| 0.8284722222222222 | 0 |
| 0.8291666666666666 | 0 |
| 0.8298611111111112 | 0 |
| 0.8305555555555556 | 0 |
| 0.8312499999999999 | 0 |
| 0.8319444444444444 | 0 |
| 0.8326388888888889 | 0 |
| 0.8333333333333334 | 0 |
| 0.8340277777777777 | 0 |
| 0.8347222222222223 | 0 |
| 0.8354166666666667 | 0 |
| 0.8361111111111111 | 0 |
| 0.8368055555555555 | 0 |
| 0.8375 | 0 |
| 0.8381944444444445 | 0 |
| 0.8388888888888889 | 0 |
| 0.8395833333333332 | 0 |
| 0.8402777777777778 | 0 |
| 0.8409722222222222 | 0 |
| 0.8416666666666667 | 0 |
| 0.842361111111111 | 0 |
| 0.8430555555555556 | 0 |
| 0.84375 | 0 |
| 0.8444444444444444 | 0 |
| 0.845138888888889 | 0 |
| 0.8458333333333333 | 0 |
| 0.8465277777777778 | 0 |
| 0.8472222222222222 | 0 |
| 0.8479166666666668 | 0 |
| 0.8486111111111111 | 0 |
| 0.8493055555555555 | 0 |
| 0.85 | 0 |
| 0.8506944444444445 | 0 |
| 0.8513888888888889 | 0 |
| 0.8520833333333333 | 0 |
| 0.8527777777777777 | 0 |
| 0.8534722222222223 | 0 |
| 0.8541666666666666 | 0 |
| 0.8548611111111111 | 0 |
| 0.8555555555555556 | 0 |
| 0.8562500000000001 | 0 |
| 0.8569444444444444 | 0 |
| 0.8576388888888888 | 0 |
| 0.8583333333333334 | 0 |
| 0.8590277777777778 | 0 |
| 0.8597222222222222 | 0 |
| 0.8604166666666666 | 0 |
| 0.8611111111111112 | 0 |
| 0.8618055555555556 | 0 |
| 0.8624999999999999 | 0 |
| 0.8631944444444444 | 0 |
| 0.8638888888888889 | 0 |
| 0.8645833333333334 | 0 |
| 0.8652777777777777 | 0 |
| 0.8659722222222223 | 0 |
| 0.8666666666666667 | 0 |
| 0.8673611111111111 | 0 |
| 0.8680555555555555 | 0 |
| 0.86875 | 0 |
| 0.8694444444444445 | 0 |
| 0.8701388888888889 | 0 |
| 0.8708333333333332 | 0 |
| 0.8715277777777778 | 0 |
| 0.8722222222222222 | 0 |
| 0.8729166666666667 | 0 |
| 0.873611111111111 | 0 |
| 0.8743055555555556 | 0 |
| 0.875 | 0 |
| 0.8756944444444444 | 0 |
| 0.876388888888889 | 0 |
| 0.8770833333333333 | 0 |
| 0.8777777777777778 | 0 |
| 0.8784722222222222 | 0 |
| 0.8791666666666668 | 0 |
| 0.8798611111111111 | 0 |
| 0.8805555555555555 | 0 |
| 0.88125 | 0 |
| 0.8819444444444445 | 0 |
| 0.8826388888888889 | 0 |
| 0.8833333333333333 | 0 |
| 0.8840277777777777 | 0 |
| 0.8847222222222223 | 0 |
| 0.8854166666666666 | 0 |
| 0.8861111111111111 | 0 |
| 0.8868055555555556 | 0 |
| 0.8875000000000001 | 0 |
| 0.8881944444444444 | 0 |
| 0.8888888888888888 | 0 |
| 0.8895833333333334 | 0 |
| 0.8902777777777778 | 0 |
| 0.8909722222222222 | 0 |
| 0.8916666666666666 | 0 |
| 0.8923611111111112 | 0 |
| 0.8930555555555556 | 0 |
| 0.8937499999999999 | 0 |
| 0.8944444444444444 | 0 |
| 0.8951388888888889 | 0 |
| 0.8958333333333334 | 0 |
| 0.8965277777777777 | 0 |
| 0.8972222222222223 | 0 |
| 0.8979166666666667 | 0 |
| 0.8986111111111111 | 0 |
| 0.8993055555555555 | 0 |
| 0.9 | 0 |
| 0.9006944444444445 | 0 |
| 0.9013888888888889 | 0 |
| 0.9020833333333332 | 0 |
| 0.9027777777777778 | 0 |
| 0.9034722222222222 | 0 |
| 0.9041666666666667 | 0 |
| 0.904861111111111 | 0 |
| 0.9055555555555556 | 0 |
| 0.90625 | 0 |
| 0.9069444444444444 | 0 |
| 0.907638888888889 | 0 |
| 0.9083333333333333 | 0 |
| 0.9090277777777778 | 0 |
| 0.9097222222222222 | 0 |
| 0.9104166666666668 | 0 |
| 0.9111111111111111 | 0 |
| 0.9118055555555555 | 0 |
| 0.9125 | 0 |
| 0.9131944444444445 | 0 |
| 0.9138888888888889 | 0 |
| 0.9145833333333333 | 0 |
| 0.9152777777777777 | 0 |
| 0.9159722222222223 | 0 |
| 0.9166666666666666 | 0 |
| 0.9173611111111111 | 0 |
| 0.9180555555555556 | 0 |
| 0.9187500000000001 | 0 |
| 0.9194444444444444 | 0 |
| 0.9201388888888888 | 0 |
| 0.9208333333333334 | 0 |
| 0.9215277777777778 | 0 |
| 0.9222222222222222 | 0 |
| 0.9229166666666666 | 0 |
| 0.9236111111111112 | 0 |
| 0.9243055555555556 | 0 |
| 0.9249999999999999 | 0 |
| 0.9256944444444444 | 0 |
| 0.9263888888888889 | 0 |
| 0.9270833333333334 | 0 |
| 0.9277777777777777 | 0 |
| 0.9284722222222223 | 0 |
| 0.9291666666666667 | 0 |
| 0.9298611111111111 | 0 |
| 0.9305555555555555 | 0 |
| 0.93125 | 0 |
| 0.9319444444444445 | 0 |
| 0.9326388888888889 | 0 |
| 0.9333333333333332 | 0 |
| 0.9340277777777778 | 0 |
| 0.9347222222222222 | 0 |
| 0.9354166666666667 | 0 |
| 0.936111111111111 | 0 |
| 0.9368055555555556 | 0 |
| 0.9375 | 0 |
| 0.9381944444444444 | 0 |
| 0.938888888888889 | 0 |
| 0.9395833333333333 | 0 |
| 0.9402777777777778 | 0 |
| 0.9409722222222222 | 0 |
| 0.9416666666666668 | 0 |
| 0.9423611111111111 | 0 |
| 0.9430555555555555 | 0 |
| 0.94375 | 0 |
| 0.9444444444444445 | 0 |
| 0.9451388888888889 | 0 |
| 0.9458333333333333 | 0 |
| 0.9465277777777777 | 0 |
| 0.9472222222222223 | 0 |
| 0.9479166666666666 | 0 |
| 0.9486111111111111 | 0 |
| 0.9493055555555556 | 0 |
| 0.9500000000000001 | 0 |
| 0.9506944444444444 | 0 |
| 0.9513888888888888 | 0 |
| 0.9520833333333334 | 0 |
| 0.9527777777777778 | 0 |
| 0.9534722222222222 | 0 |
| 0.9541666666666666 | 0 |
| 0.9548611111111112 | 0 |
| 0.9555555555555556 | 0 |
| 0.9562499999999999 | 0 |
| 0.9569444444444444 | 0 |
| 0.9576388888888889 | 0 |
| 0.9583333333333334 | 0 |
| 0.9590277777777777 | 0 |
| 0.9597222222222223 | 0 |
| 0.9604166666666667 | 0 |
| 0.9611111111111111 | 0 |
| 0.9618055555555555 | 0 |
| 0.9625 | 0 |
| 0.9631944444444445 | 0 |
| 0.9638888888888889 | 0 |
| 0.9645833333333332 | 0 |
| 0.9652777777777778 | 0 |
| 0.9659722222222222 | 0 |
| 0.9666666666666667 | 0 |
| 0.967361111111111 | 0 |
| 0.9680555555555556 | 0 |
| 0.96875 | 0 |
| 0.9694444444444444 | 0 |
| 0.970138888888889 | 0 |
| 0.9708333333333333 | 0 |
| 0.9715277777777778 | 0 |
| 0.9722222222222222 | 0 |
| 0.9729166666666668 | 0 |
| 0.9736111111111111 | 0 |
| 0.9743055555555555 | 0 |
| 0.975 | 0 |
| 0.9756944444444445 | 0 |
| 0.9763888888888889 | 0 |
| 0.9770833333333333 | 0 |
| 0.9777777777777777 | 0 |
| 0.9784722222222223 | 0 |
| 0.9791666666666666 | 0 |
| 0.9798611111111111 | 0 |
| 0.9805555555555556 | 0 |
| 0.9812500000000001 | 0 |
| 0.9819444444444444 | 0 |
| 0.9826388888888888 | 0 |
| 0.9833333333333334 | 0 |
| 0.9840277777777778 | 0 |
| 0.9847222222222222 | 0 |
| 0.9854166666666666 | 0 |
| 0.9861111111111112 | 0 |
| 0.9868055555555556 | 0 |
| 0.9874999999999999 | 0 |
| 0.9881944444444444 | 0 |
| 0.9888888888888889 | 0 |
| 0.9895833333333334 | 0 |
| 0.9902777777777777 | 0 |
| 0.9909722222222223 | 0 |
| 0.9916666666666667 | 0 |
| 0.9923611111111111 | 0 |
| 0.9930555555555555 | 0 |
| 0.99375 | 0 |
| 0.9944444444444445 | 0 |
| 0.9951388888888889 | 0 |
| 0.9958333333333332 | 0 |
| 0.9965277777777778 | 0 |
| 0.9972222222222222 | 0 |
| 0.9979166666666667 | 0 |
| 0.998611111111111 | 0 |
| 0.9993055555555556 | 0 |